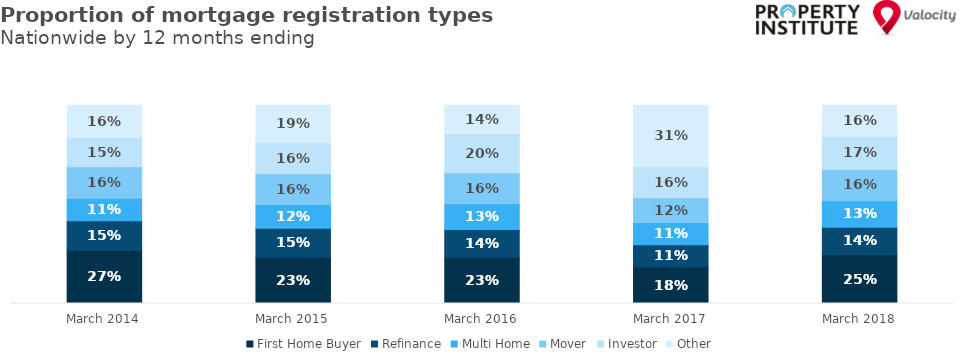
| Category | First Home Buyer | Refinance | Multi Home | Mover | Investor | Other |
|---|---|---|---|---|---|---|
| 2014-03-01 | 0.268 | 0.15 | 0.113 | 0.159 | 0.147 | 0.163 |
| 2015-03-01 | 0.233 | 0.147 | 0.119 | 0.155 | 0.156 | 0.19 |
| 2016-03-01 | 0.233 | 0.14 | 0.129 | 0.156 | 0.197 | 0.143 |
| 2017-03-01 | 0.184 | 0.112 | 0.112 | 0.124 | 0.156 | 0.311 |
| 2018-03-01 | 0.246 | 0.138 | 0.133 | 0.159 | 0.167 | 0.156 |